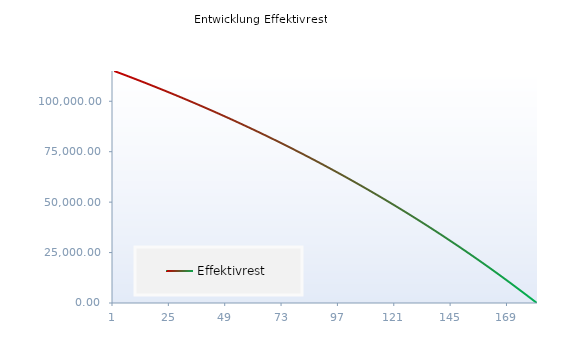
| Category | Effektivrest |
|---|---|
| 0 | 115000 |
| 1 | 114565.75 |
| 2 | 114129.731 |
| 3 | 113691.936 |
| 4 | 113252.357 |
| 5 | 112810.987 |
| 6 | 112367.819 |
| 7 | 111922.846 |
| 8 | 111476.059 |
| 9 | 111027.453 |
| 10 | 110577.018 |
| 11 | 110124.749 |
| 12 | 109670.637 |
| 13 | 109214.675 |
| 14 | 108756.855 |
| 15 | 108297.17 |
| 16 | 107835.612 |
| 17 | 107372.174 |
| 18 | 106906.847 |
| 19 | 106439.625 |
| 20 | 105970.499 |
| 21 | 105499.462 |
| 22 | 105026.506 |
| 23 | 104551.623 |
| 24 | 104074.806 |
| 25 | 103596.045 |
| 26 | 103115.335 |
| 27 | 102632.665 |
| 28 | 102148.03 |
| 29 | 101661.419 |
| 30 | 101172.827 |
| 31 | 100682.243 |
| 32 | 100189.661 |
| 33 | 99695.072 |
| 34 | 99198.469 |
| 35 | 98699.841 |
| 36 | 98199.183 |
| 37 | 97696.485 |
| 38 | 97191.738 |
| 39 | 96684.935 |
| 40 | 96176.068 |
| 41 | 95665.127 |
| 42 | 95152.105 |
| 43 | 94636.992 |
| 44 | 94119.781 |
| 45 | 93600.463 |
| 46 | 93079.029 |
| 47 | 92555.47 |
| 48 | 92029.779 |
| 49 | 91501.946 |
| 50 | 90971.962 |
| 51 | 90439.819 |
| 52 | 89905.508 |
| 53 | 89369.021 |
| 54 | 88830.347 |
| 55 | 88289.479 |
| 56 | 87746.407 |
| 57 | 87201.123 |
| 58 | 86653.617 |
| 59 | 86103.881 |
| 60 | 85551.905 |
| 61 | 84997.68 |
| 62 | 84441.197 |
| 63 | 83882.447 |
| 64 | 83321.421 |
| 65 | 82758.108 |
| 66 | 82192.501 |
| 67 | 81624.59 |
| 68 | 81054.365 |
| 69 | 80481.816 |
| 70 | 79906.935 |
| 71 | 79329.712 |
| 72 | 78750.137 |
| 73 | 78168.201 |
| 74 | 77583.894 |
| 75 | 76997.206 |
| 76 | 76408.129 |
| 77 | 75816.651 |
| 78 | 75222.763 |
| 79 | 74626.456 |
| 80 | 74027.72 |
| 81 | 73426.544 |
| 82 | 72822.919 |
| 83 | 72216.834 |
| 84 | 71608.281 |
| 85 | 70997.248 |
| 86 | 70383.726 |
| 87 | 69767.704 |
| 88 | 69149.172 |
| 89 | 68528.12 |
| 90 | 67904.538 |
| 91 | 67278.416 |
| 92 | 66649.743 |
| 93 | 66018.508 |
| 94 | 65384.702 |
| 95 | 64748.313 |
| 96 | 64109.332 |
| 97 | 63467.747 |
| 98 | 62823.549 |
| 99 | 62176.726 |
| 100 | 61527.267 |
| 101 | 60875.163 |
| 102 | 60220.402 |
| 103 | 59562.974 |
| 104 | 58902.867 |
| 105 | 58240.07 |
| 106 | 57574.574 |
| 107 | 56906.366 |
| 108 | 56235.435 |
| 109 | 55561.771 |
| 110 | 54885.363 |
| 111 | 54206.199 |
| 112 | 53524.268 |
| 113 | 52839.558 |
| 114 | 52152.059 |
| 115 | 51461.759 |
| 116 | 50768.647 |
| 117 | 50072.711 |
| 118 | 49373.939 |
| 119 | 48672.321 |
| 120 | 47967.844 |
| 121 | 47260.497 |
| 122 | 46550.268 |
| 123 | 45837.146 |
| 124 | 45121.118 |
| 125 | 44402.173 |
| 126 | 43680.299 |
| 127 | 42955.484 |
| 128 | 42227.716 |
| 129 | 41496.983 |
| 130 | 40763.273 |
| 131 | 40026.574 |
| 132 | 39286.873 |
| 133 | 38544.159 |
| 134 | 37798.418 |
| 135 | 37049.64 |
| 136 | 36297.811 |
| 137 | 35542.919 |
| 138 | 34784.951 |
| 139 | 34023.895 |
| 140 | 33259.739 |
| 141 | 32492.469 |
| 142 | 31722.074 |
| 143 | 30948.539 |
| 144 | 30171.854 |
| 145 | 29392.004 |
| 146 | 28608.976 |
| 147 | 27822.759 |
| 148 | 27033.338 |
| 149 | 26240.702 |
| 150 | 25444.836 |
| 151 | 24645.727 |
| 152 | 23843.363 |
| 153 | 23037.73 |
| 154 | 22228.814 |
| 155 | 21416.603 |
| 156 | 20601.083 |
| 157 | 19782.241 |
| 158 | 18960.062 |
| 159 | 18134.534 |
| 160 | 17305.642 |
| 161 | 16473.374 |
| 162 | 15637.714 |
| 163 | 14798.65 |
| 164 | 13956.168 |
| 165 | 13110.253 |
| 166 | 12260.892 |
| 167 | 11408.07 |
| 168 | 10551.774 |
| 169 | 9691.99 |
| 170 | 8828.702 |
| 171 | 7961.897 |
| 172 | 7091.561 |
| 173 | 6217.679 |
| 174 | 5340.237 |
| 175 | 4459.22 |
| 176 | 3574.613 |
| 177 | 2686.403 |
| 178 | 1794.573 |
| 179 | 899.111 |
| 180 | 0 |